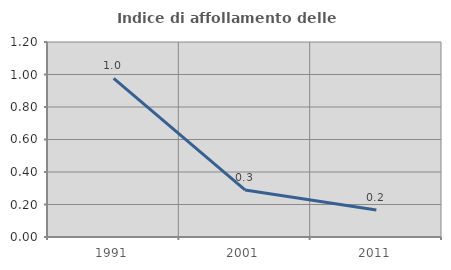
| Category | Indice di affollamento delle abitazioni  |
|---|---|
| 1991.0 | 0.976 |
| 2001.0 | 0.29 |
| 2011.0 | 0.166 |